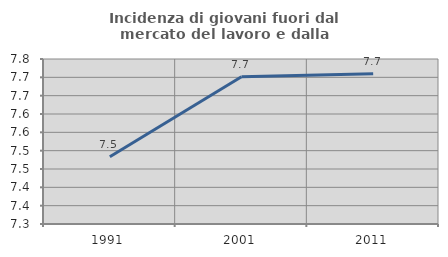
| Category | Incidenza di giovani fuori dal mercato del lavoro e dalla formazione  |
|---|---|
| 1991.0 | 7.484 |
| 2001.0 | 7.701 |
| 2011.0 | 7.71 |